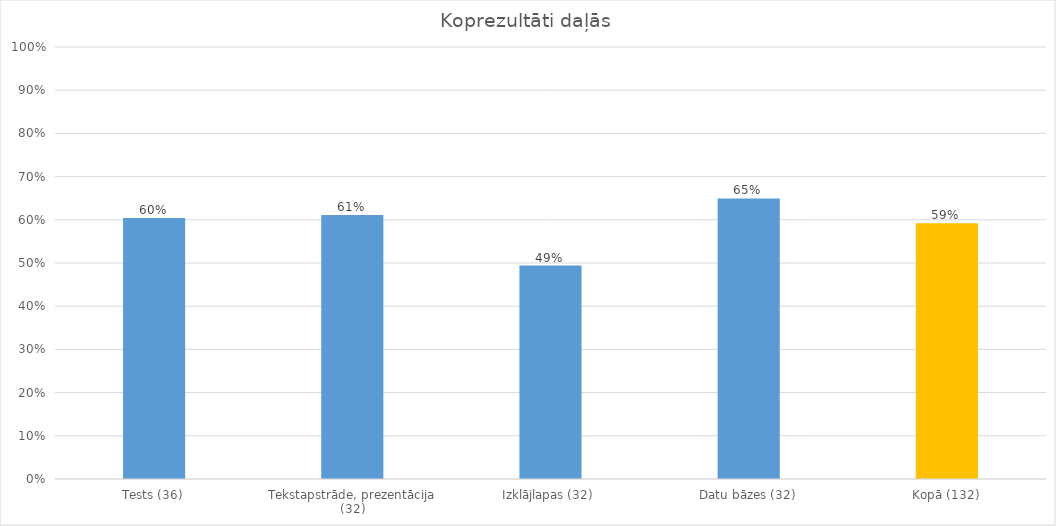
| Category | Series 0 |
|---|---|
| Tests (36) | 0.604 |
| Tekstapstrāde, prezentācija (32) | 0.611 |
| Izklājlapas (32) | 0.494 |
| Datu bāzes (32) | 0.649 |
| Kopā (132) | 0.592 |